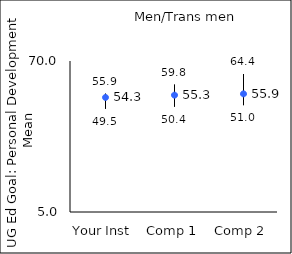
| Category | 25th percentile | 75th percentile | Mean |
|---|---|---|---|
| Your Inst | 49.5 | 55.9 | 54.31 |
| Comp 1 | 50.4 | 59.8 | 55.3 |
| Comp 2 | 51 | 64.4 | 55.86 |